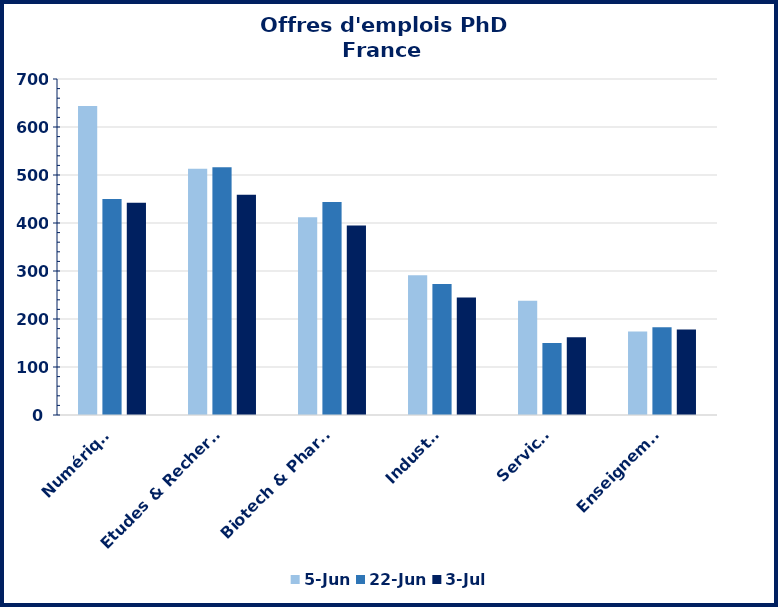
| Category | 05-juin | 22-juin | 03-juil |
|---|---|---|---|
| ​Numérique | 644 | 450 | 442 |
| Etudes & Recherche | 513 | 516 | 459 |
| Biotech & Pharma | 412 | 444 | 395 |
| Industrie | 291 | 273 | 245 |
| Services | 238 | 150 | 162 |
| Enseignement | 174 | 183 | 178 |